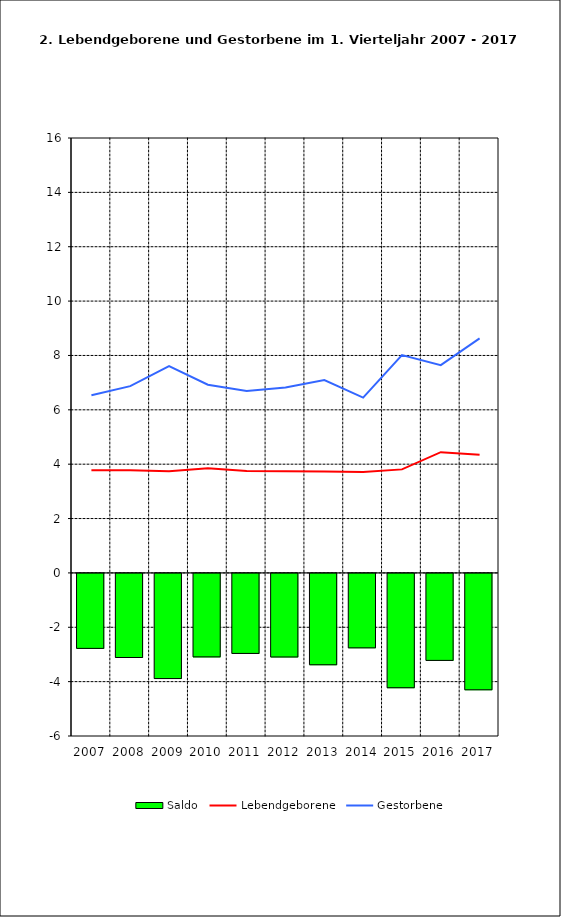
| Category | Saldo |
|---|---|
| 2005.0 | -2.758 |
| 2006.0 | -3.094 |
| 2007.0 | -3.869 |
| 2008.0 | -3.071 |
| 2009.0 | -2.944 |
| 2010.0 | -3.075 |
| 2011.0 | -3.361 |
| 2012.0 | -2.739 |
| 2013.0 | -4.206 |
| 2014.0 | -3.2 |
| 2015.0 | -4.282 |